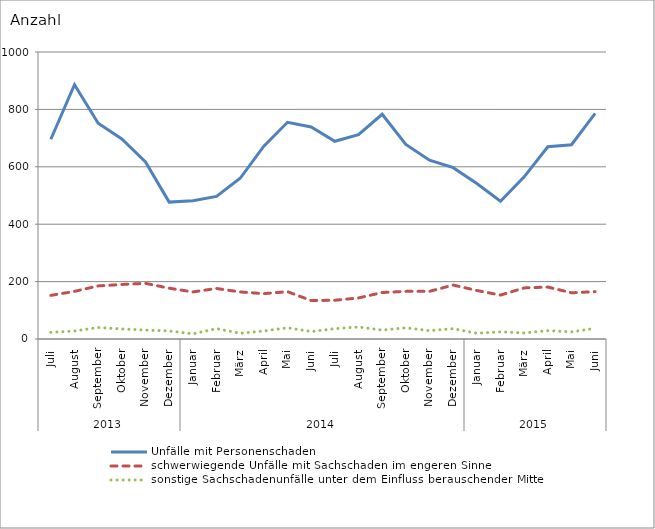
| Category | Unfälle mit Personenschaden | schwerwiegende Unfälle mit Sachschaden im engeren Sinne | sonstige Sachschadenunfälle unter dem Einfluss berauschender Mittel |
|---|---|---|---|
| 0 | 696 | 152 | 23 |
| 1 | 886 | 166 | 28 |
| 2 | 752 | 185 | 40 |
| 3 | 697 | 190 | 35 |
| 4 | 617 | 194 | 31 |
| 5 | 477 | 177 | 28 |
| 6 | 482 | 164 | 18 |
| 7 | 497 | 176 | 36 |
| 8 | 560 | 164 | 20 |
| 9 | 672 | 158 | 28 |
| 10 | 755 | 165 | 39 |
| 11 | 739 | 134 | 26 |
| 12 | 689 | 135 | 36 |
| 13 | 712 | 143 | 42 |
| 14 | 783 | 162 | 31 |
| 15 | 678 | 166 | 39 |
| 16 | 623 | 166 | 29 |
| 17 | 597 | 188 | 36 |
| 18 | 542 | 169 | 20 |
| 19 | 480 | 153 | 25 |
| 20 | 565 | 178 | 21 |
| 21 | 670 | 181 | 29 |
| 22 | 677 | 161 | 25 |
| 23 | 786 | 165 | 37 |